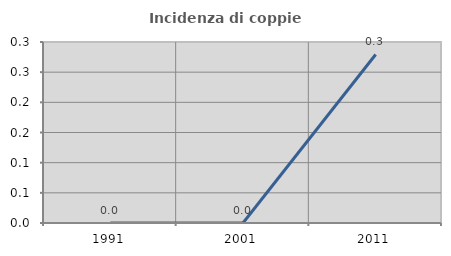
| Category | Incidenza di coppie miste |
|---|---|
| 1991.0 | 0 |
| 2001.0 | 0 |
| 2011.0 | 0.279 |